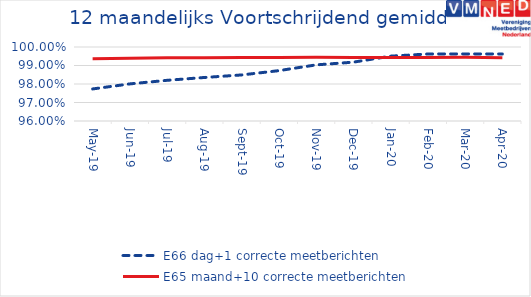
| Category | E66 dag+1 correcte meetberichten | E65 maand+10 correcte meetberichten |
|---|---|---|
| 2019-05-01 | 0.977 | 0.994 |
| 2019-06-01 | 0.98 | 0.994 |
| 2019-07-01 | 0.982 | 0.994 |
| 2019-08-01 | 0.984 | 0.994 |
| 2019-09-01 | 0.985 | 0.994 |
| 2019-10-01 | 0.987 | 0.994 |
| 2019-11-01 | 0.99 | 0.994 |
| 2019-12-01 | 0.992 | 0.994 |
| 2020-01-01 | 0.995 | 0.994 |
| 2020-02-01 | 0.996 | 0.994 |
| 2020-03-01 | 0.996 | 0.994 |
| 2020-04-01 | 0.996 | 0.994 |